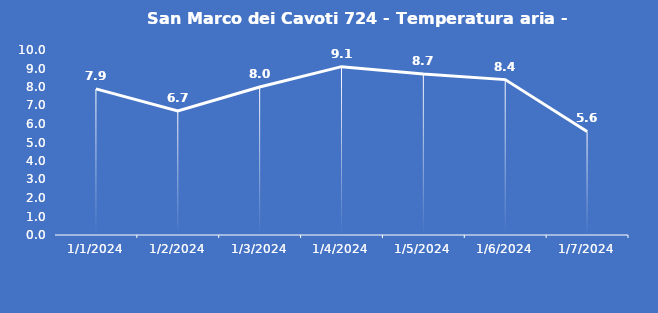
| Category | San Marco dei Cavoti 724 - Temperatura aria - Grezzo (°C) |
|---|---|
| 1/1/24 | 7.9 |
| 1/2/24 | 6.7 |
| 1/3/24 | 8 |
| 1/4/24 | 9.1 |
| 1/5/24 | 8.7 |
| 1/6/24 | 8.4 |
| 1/7/24 | 5.6 |